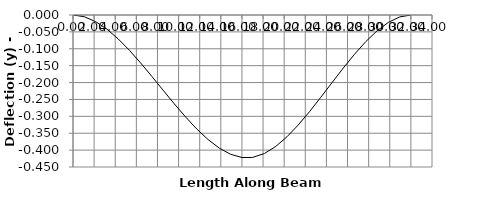
| Category | y |
|---|---|
| 0.0 | 0 |
| 0.0 | 0 |
| 1.0666666666666667 | -0.005 |
| 2.1333333333333333 | -0.019 |
| 3.2 | -0.042 |
| 4.266666666666667 | -0.07 |
| 5.333333333333333 | -0.104 |
| 6.4 | -0.142 |
| 7.466666666666667 | -0.182 |
| 8.533333333333333 | -0.223 |
| 9.6 | -0.263 |
| 10.666666666666666 | -0.302 |
| 11.733333333333333 | -0.338 |
| 12.8 | -0.369 |
| 13.866666666666667 | -0.394 |
| 14.933333333333334 | -0.412 |
| 16.0 | -0.422 |
| 16.999 | -0.422 |
| 17.001 | -0.422 |
| 17.066666666666666 | -0.421 |
| 18.133333333333333 | -0.41 |
| 19.2 | -0.389 |
| 20.266666666666666 | -0.36 |
| 21.333333333333332 | -0.326 |
| 22.4 | -0.286 |
| 23.466666666666665 | -0.244 |
| 24.53333333333333 | -0.2 |
| 25.6 | -0.157 |
| 26.666666666666668 | -0.116 |
| 27.733333333333334 | -0.079 |
| 28.8 | -0.047 |
| 29.866666666666667 | -0.022 |
| 30.933333333333334 | -0.006 |
| 32.0 | 0 |